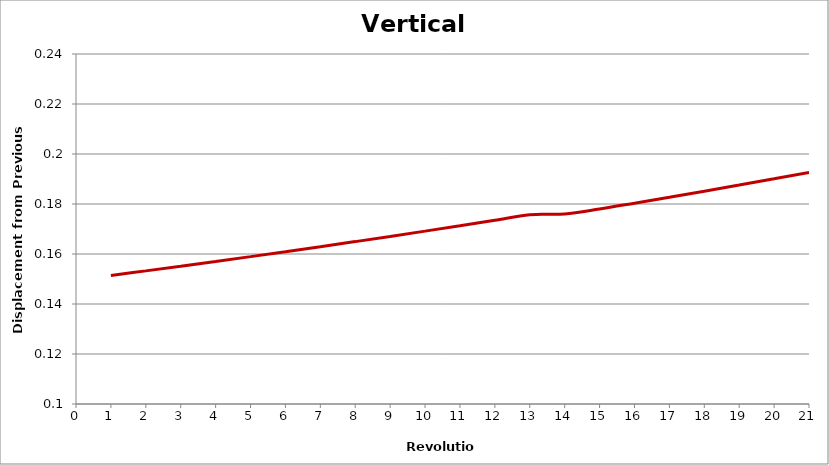
| Category | Displacment from Previous |
|---|---|
| 1.0 | 0.151 |
| 2.0 | 0.153 |
| 3.0 | 0.155 |
| 4.0 | 0.157 |
| 5.0 | 0.159 |
| 6.0 | 0.161 |
| 7.0 | 0.163 |
| 8.0 | 0.165 |
| 9.0 | 0.167 |
| 10.0 | 0.169 |
| 11.0 | 0.171 |
| 12.0 | 0.173 |
| 13.0 | 0.176 |
| 14.0 | 0.176 |
| 15.0 | 0.178 |
| 16.0 | 0.18 |
| 17.0 | 0.183 |
| 18.0 | 0.185 |
| 19.0 | 0.188 |
| 20.0 | 0.19 |
| 21.0 | 0.193 |
| 22.0 | 0.195 |
| 23.0 | 0.198 |
| 24.0 | 0.201 |
| 25.0 | 0.203 |
| 26.0 | 0.206 |
| 27.0 | 0.209 |